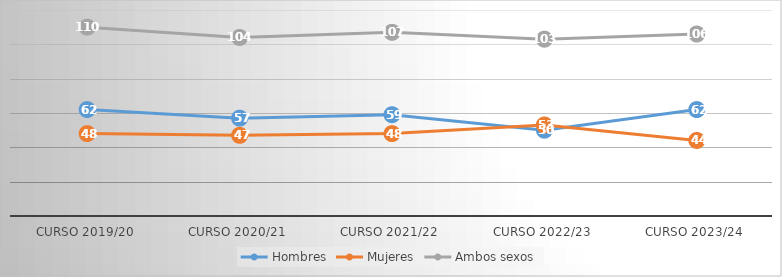
| Category | Hombres | Mujeres | Ambos sexos |
|---|---|---|---|
| Curso 2019/20 | 62 | 48 | 110 |
| Curso 2020/21 | 57 | 47 | 104 |
| Curso 2021/22 | 59 | 48 | 107 |
| Curso 2022/23 | 50 | 53 | 103 |
| Curso 2023/24 | 62 | 44 | 106 |